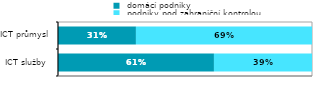
| Category |  domácí podniky |  podniky pod zahraniční kontrolou |
|---|---|---|
| ICT služby  | 0.614 | 0.386 |
| ICT průmysl | 0.307 | 0.693 |